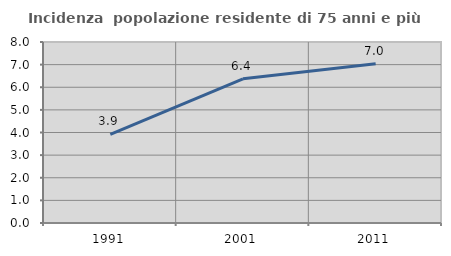
| Category | Incidenza  popolazione residente di 75 anni e più |
|---|---|
| 1991.0 | 3.917 |
| 2001.0 | 6.375 |
| 2011.0 | 7.035 |